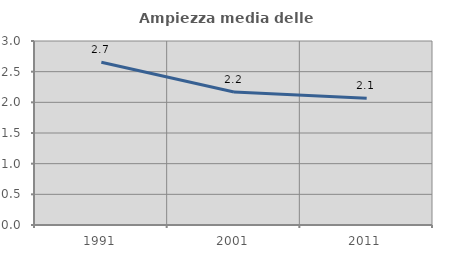
| Category | Ampiezza media delle famiglie |
|---|---|
| 1991.0 | 2.653 |
| 2001.0 | 2.168 |
| 2011.0 | 2.068 |